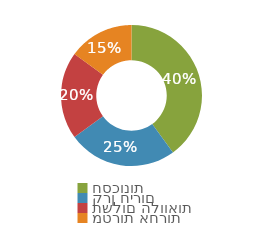
| Category | Series 0 |
|---|---|
| חסכונות | 0.4 |
| קרן חירום | 0.25 |
| תשלום הלוואות | 0.2 |
| מטרות אחרות  | 0.15 |